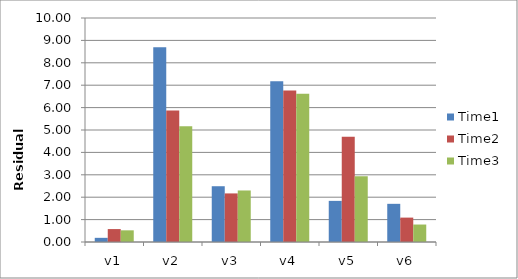
| Category | Time1 | Time2 | Time3 |
|---|---|---|---|
| v1 | 0.186 | 0.577 | 0.521 |
| v2 | 8.692 | 5.868 | 5.162 |
| v3 | 2.49 | 2.169 | 2.3 |
| v4 | 7.174 | 6.758 | 6.616 |
| v5 | 1.836 | 4.696 | 2.93 |
| v6 | 1.704 | 1.089 | 0.78 |